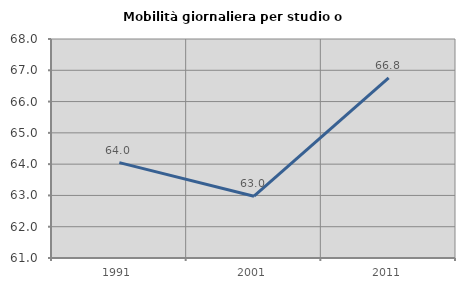
| Category | Mobilità giornaliera per studio o lavoro |
|---|---|
| 1991.0 | 64.049 |
| 2001.0 | 62.976 |
| 2011.0 | 66.759 |